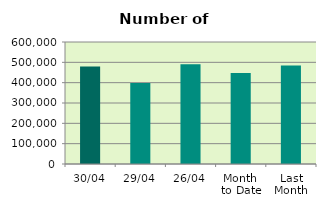
| Category | Series 0 |
|---|---|
| 30/04 | 479450 |
| 29/04 | 398860 |
| 26/04 | 490684 |
| Month 
to Date | 447135.9 |
| Last
Month | 483948.286 |